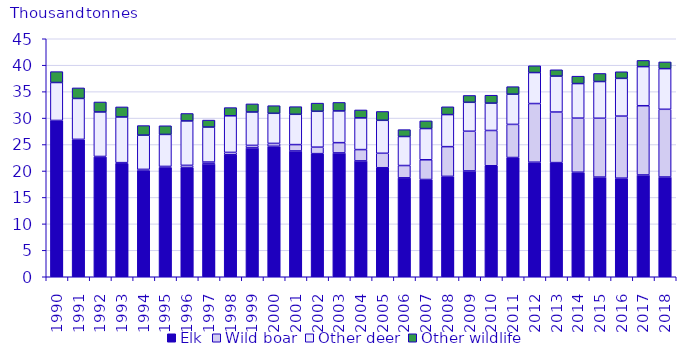
| Category | Elk | Wild boar | Other deer | Other wildlife |
|---|---|---|---|---|
| 1990.0 | 29.516 | 0.038 | 7.172 | 2.058 |
| 1991.0 | 25.913 | 0.066 | 7.734 | 1.995 |
| 1992.0 | 22.67 | 0.073 | 8.416 | 1.885 |
| 1993.0 | 21.398 | 0.178 | 8.637 | 1.903 |
| 1994.0 | 20.117 | 0.187 | 6.471 | 1.808 |
| 1995.0 | 20.688 | 0.173 | 6.051 | 1.637 |
| 1996.0 | 20.644 | 0.419 | 8.402 | 1.405 |
| 1997.0 | 21.34 | 0.347 | 6.62 | 1.314 |
| 1998.0 | 23.061 | 0.451 | 6.923 | 1.547 |
| 1999.0 | 24.364 | 0.477 | 6.306 | 1.536 |
| 2000.0 | 24.676 | 0.539 | 5.693 | 1.438 |
| 2001.0 | 23.79 | 1.198 | 5.726 | 1.445 |
| 2002.0 | 23.278 | 1.222 | 6.787 | 1.542 |
| 2003.0 | 23.415 | 1.941 | 6.001 | 1.602 |
| 2004.0 | 21.905 | 2.139 | 5.993 | 1.502 |
| 2005.0 | 20.615 | 2.732 | 6.232 | 1.674 |
| 2006.0 | 18.701 | 2.328 | 5.489 | 1.3 |
| 2007.0 | 18.385 | 3.733 | 5.903 | 1.451 |
| 2008.0 | 18.981 | 5.617 | 6.064 | 1.474 |
| 2009.0 | 20.007 | 7.509 | 5.467 | 1.296 |
| 2010.0 | 20.985 | 6.672 | 5.173 | 1.495 |
| 2011.0 | 22.547 | 6.262 | 5.709 | 1.424 |
| 2012.0 | 21.658 | 11.091 | 5.858 | 1.282 |
| 2013.0 | 21.582 | 9.562 | 6.793 | 1.197 |
| 2014.0 | 19.77 | 10.219 | 6.536 | 1.401 |
| 2015.0 | 18.84 | 11.129 | 6.942 | 1.525 |
| 2016.0 | 18.641 | 11.733 | 7.134 | 1.255 |
| 2017.0 | 19.246 | 13.091 | 7.39 | 1.178 |
| 2018.0 | 18.854 | 12.808 | 7.686 | 1.268 |